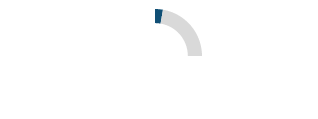
| Category | Series 0 |
|---|---|
| 0 | 0.027 |
| 1 | 0.223 |
| 2 | 0.75 |